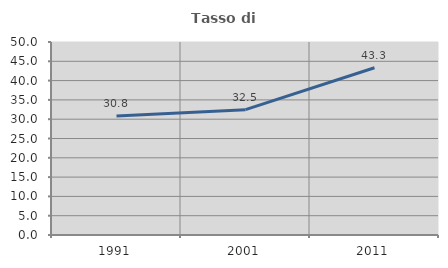
| Category | Tasso di occupazione   |
|---|---|
| 1991.0 | 30.814 |
| 2001.0 | 32.468 |
| 2011.0 | 43.333 |